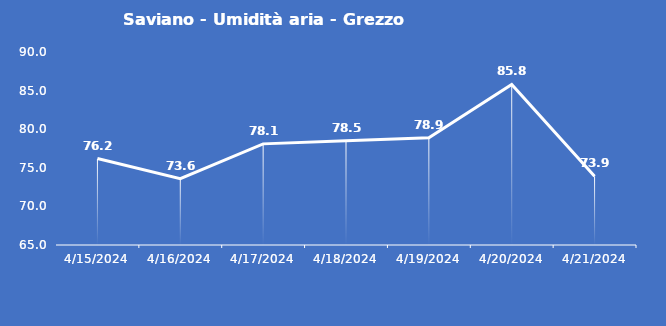
| Category | Saviano - Umidità aria - Grezzo (%) |
|---|---|
| 4/15/24 | 76.2 |
| 4/16/24 | 73.6 |
| 4/17/24 | 78.1 |
| 4/18/24 | 78.5 |
| 4/19/24 | 78.9 |
| 4/20/24 | 85.8 |
| 4/21/24 | 73.9 |